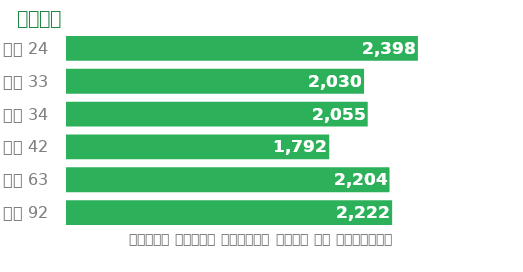
| Category | Series 0 |
|---|---|
| 24.0 | 2398 |
| 33.0 | 2030 |
| 34.0 | 2055 |
| 42.0 | 1792 |
| 63.0 | 2204 |
| 92.0 | 2222 |